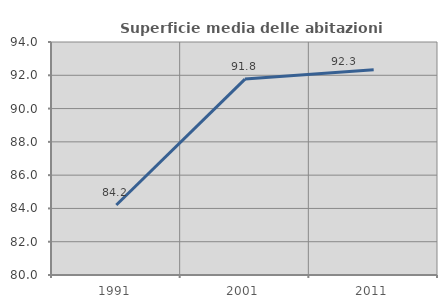
| Category | Superficie media delle abitazioni occupate |
|---|---|
| 1991.0 | 84.209 |
| 2001.0 | 91.772 |
| 2011.0 | 92.328 |